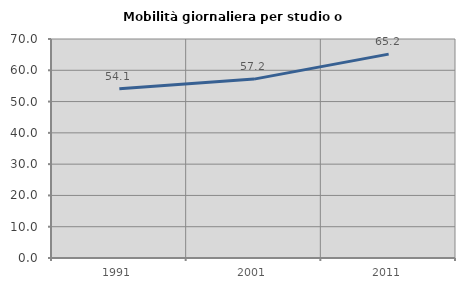
| Category | Mobilità giornaliera per studio o lavoro |
|---|---|
| 1991.0 | 54.132 |
| 2001.0 | 57.178 |
| 2011.0 | 65.158 |